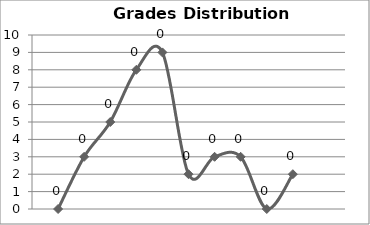
| Category | Series 0 |
|---|---|
| 0 | 0 |
| 1 | 3 |
| 2 | 5 |
| 3 | 8 |
| 4 | 9 |
| 5 | 2 |
| 6 | 3 |
| 7 | 3 |
| 8 | 0 |
| 9 | 2 |